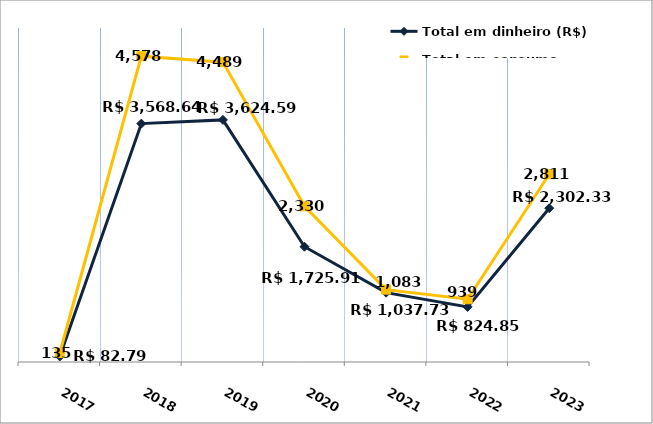
| Category | Total em dinheiro (R$) |
|---|---|
| 2017.0 | 82.79 |
| 2018.0 | 3568.64 |
| 2019.0 | 3624.59 |
| 2020.0 | 1725.91 |
| 2021.0 | 1037.73 |
| 2022.0 | 824.85 |
| 2023.0 | 2302.33 |